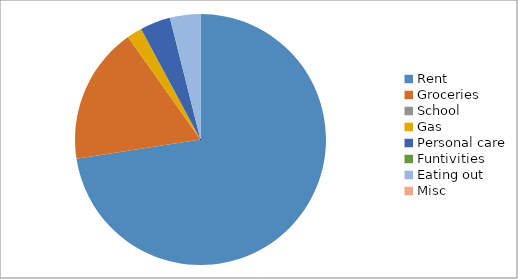
| Category | Series 0 |
|---|---|
| Rent | 370 |
| Groceries | 90 |
| School | 0 |
| Gas | 10 |
| Personal care | 20 |
| Funtivities | 0 |
| Eating out | 20 |
| Misc | 0 |